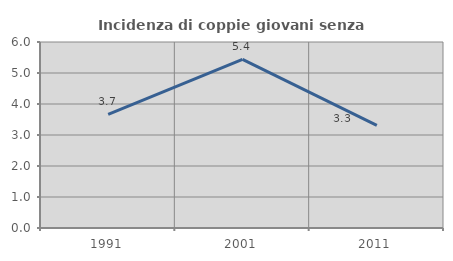
| Category | Incidenza di coppie giovani senza figli |
|---|---|
| 1991.0 | 3.667 |
| 2001.0 | 5.442 |
| 2011.0 | 3.31 |